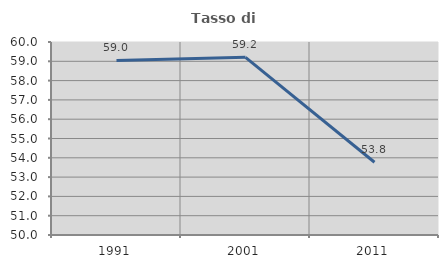
| Category | Tasso di occupazione   |
|---|---|
| 1991.0 | 59.045 |
| 2001.0 | 59.205 |
| 2011.0 | 53.769 |